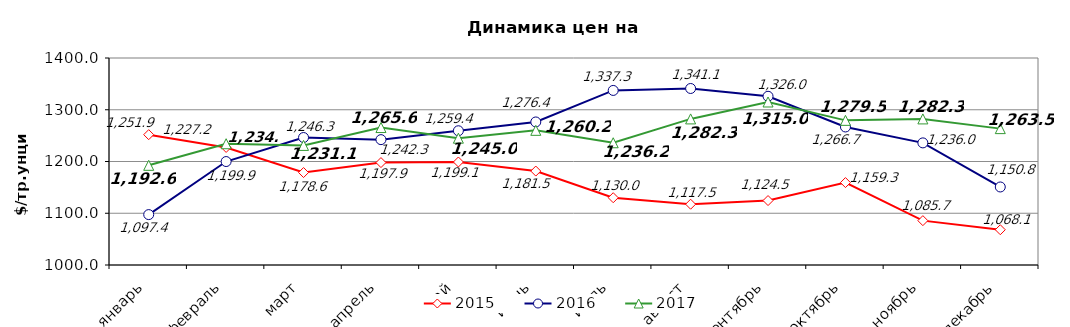
| Category | 2015 | 2016 | 2017 |
|---|---|---|---|
| январь | 1251.85 | 1097.38 | 1192.62 |
| февраль | 1227.19 | 1199.91 | 1234.33 |
| март | 1178.63 | 1246.34 | 1231.07 |
| апрель | 1197.91 | 1242.26 | 1265.63 |
| май | 1199.05 | 1259.4 | 1245 |
| июнь | 1181.5 | 1276.4 | 1260.22 |
| июль | 1130.04 | 1337.33 | 1236.22 |
| август | 1117.48 | 1341.09 | 1282.3 |
| сентябрь | 1124.53 | 1326.03 | 1314.98 |
| октябрь | 1159.25 | 1266.71 | 1279.51 |
| ноябрь | 1085.7 | 1235.98 | 1282.28 |
| декабрь | 1068.14 | 1150.77 | 1263.54 |